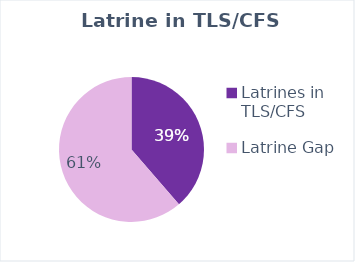
| Category | Series 0 |
|---|---|
| Latrines in TLS/CFS | 179 |
| Latrine Gap | 284.08 |